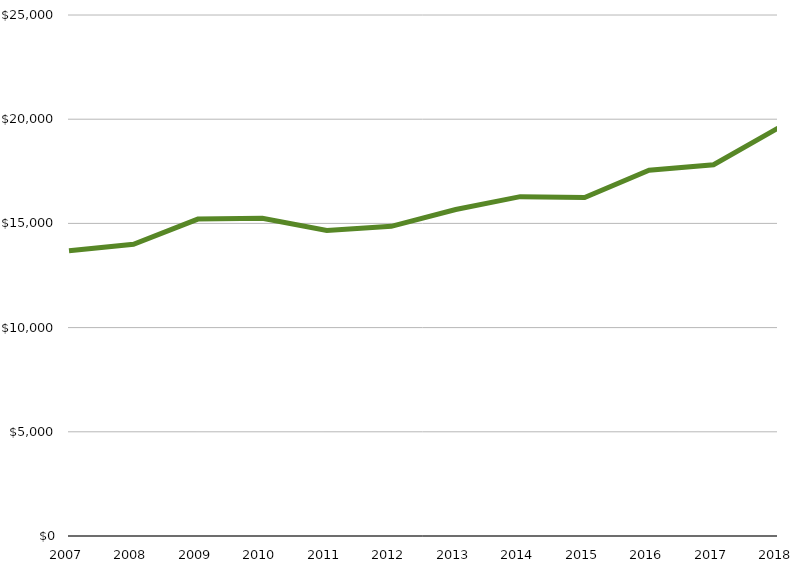
| Category | Per Student Spending |
|---|---|
| 2007 | 13684.244 |
| 2008 | 13997.274 |
| 2009 | 15205.536 |
| 2010 | 15241.931 |
| 2011 | 14661.903 |
| 2012 | 14858.403 |
| 2013 | 15666.5 |
| 2014 | 16282.56 |
| 2015 | 16241.436 |
| 2016 | 17547.088 |
| 2017 | 17814.687 |
| 2018 | 19574.675 |